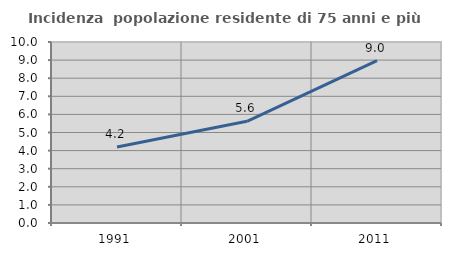
| Category | Incidenza  popolazione residente di 75 anni e più |
|---|---|
| 1991.0 | 4.201 |
| 2001.0 | 5.618 |
| 2011.0 | 8.967 |